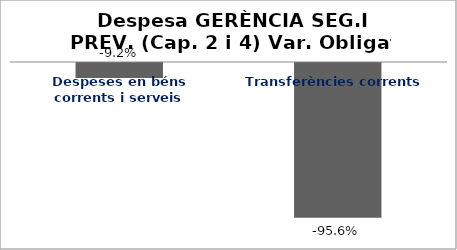
| Category | Series 0 |
|---|---|
| Despeses en béns corrents i serveis | -0.092 |
| Transferències corrents | -0.956 |